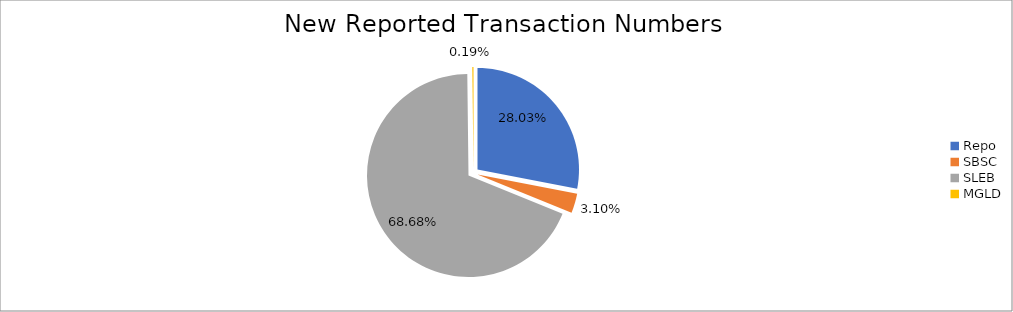
| Category | Series 0 |
|---|---|
| Repo | 363541 |
| SBSC | 40251 |
| SLEB | 890788 |
| MGLD | 2461 |